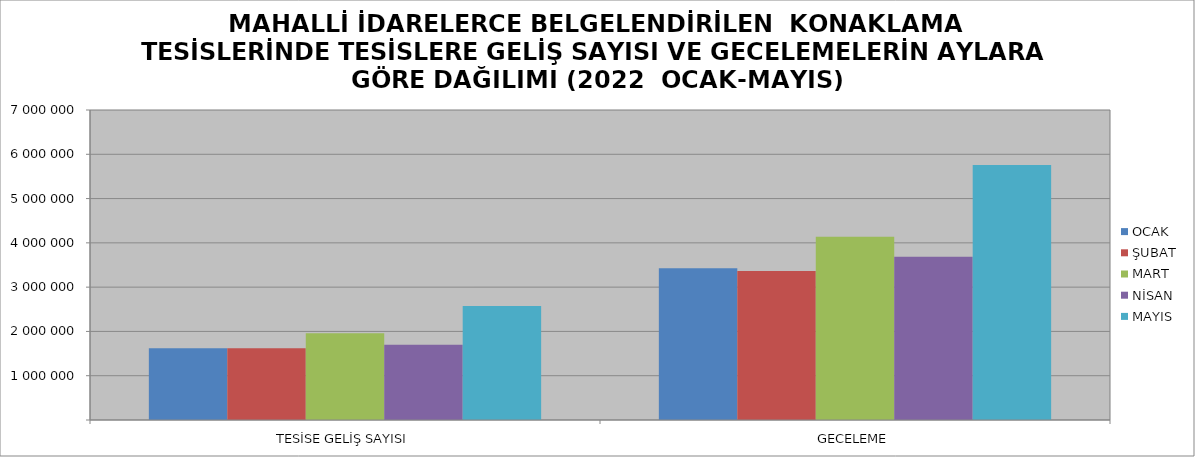
| Category | OCAK | ŞUBAT | MART | NİSAN | MAYIS |
|---|---|---|---|---|---|
| TESİSE GELİŞ SAYISI | 1617436 | 1619305 | 1960867 | 1699422 | 2574819 |
| GECELEME | 3427709 | 3362025 | 4136510 | 3684991 | 5758959 |